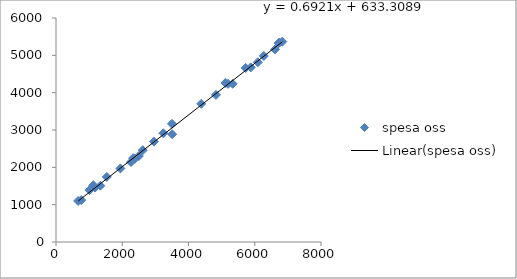
| Category | spesa oss |
|---|---|
| 6739.0 | 5341.529 |
| 3241.0 | 2912.192 |
| 1127.0 | 1519.348 |
| 2382.0 | 2228.186 |
| 6613.0 | 5159.377 |
| 2619.0 | 2458.562 |
| 2264.0 | 2141.466 |
| 762.0 | 1121.678 |
| 3508.0 | 2886.605 |
| 2500.0 | 2302.257 |
| 1179.0 | 1457.788 |
| 4828.0 | 3940.44 |
| 1532.0 | 1741.964 |
| 1340.0 | 1508.563 |
| 5193.0 | 4237.149 |
| 6722.0 | 5325.024 |
| 3500.0 | 3165.613 |
| 6093.0 | 4814.745 |
| 2328.0 | 2245.793 |
| 5114.0 | 4259.301 |
| 4383.0 | 3700.555 |
| 668.0 | 1099.802 |
| 6832.0 | 5366.417 |
| 5726.0 | 4662.034 |
| 1011.0 | 1388.509 |
| 5333.0 | 4237.232 |
| 6272.0 | 4982.296 |
| 1944.0 | 1970.063 |
| 2955.0 | 2689.488 |
| 5880.0 | 4677.027 |